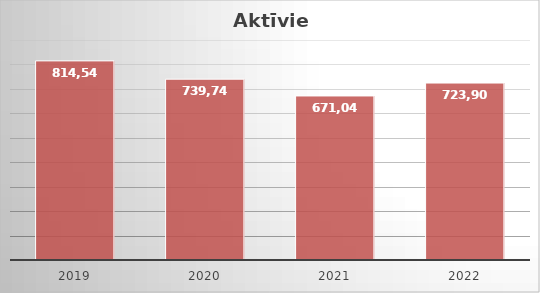
| Category | Series 0 |
|---|---|
| 2019 | 814540 |
| 2020 | 739744 |
| 2021 | 671048 |
| 2022 | 723907 |